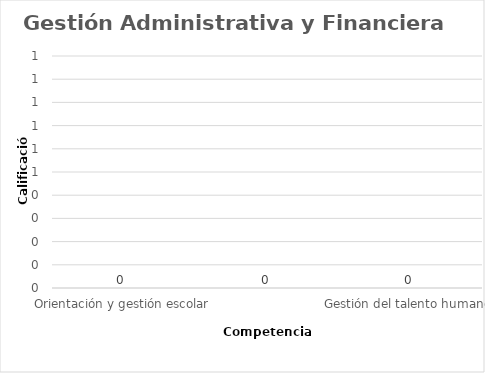
| Category | Series 0 |
|---|---|
| Orientación y gestión escolar | 0 |
| Administración de la planta física, los recursos y los servicios complementarios | 0 |
| Gestión del talento humano | 0 |